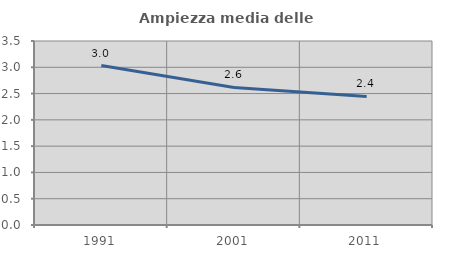
| Category | Ampiezza media delle famiglie |
|---|---|
| 1991.0 | 3.032 |
| 2001.0 | 2.616 |
| 2011.0 | 2.446 |